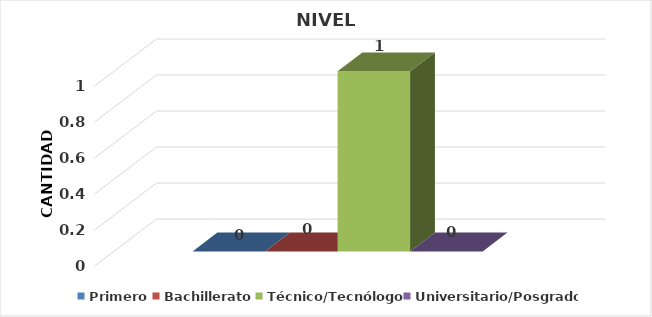
| Category | Primero | Bachillerato | Técnico/Tecnólogo | Universitario/Posgrado |
|---|---|---|---|---|
| 0 | 0 | 0 | 1 | 0 |